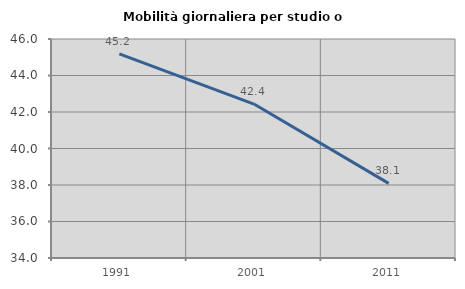
| Category | Mobilità giornaliera per studio o lavoro |
|---|---|
| 1991.0 | 45.182 |
| 2001.0 | 42.434 |
| 2011.0 | 38.09 |